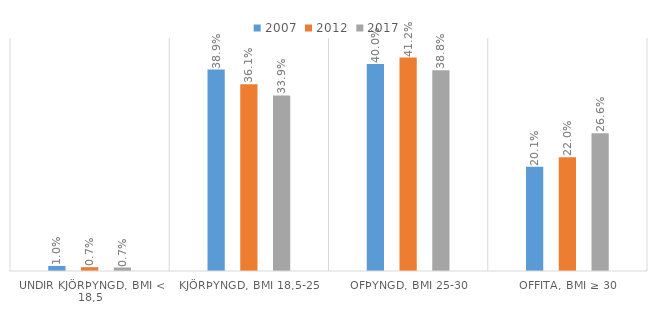
| Category | 2007 | 2012 | 2017 |
|---|---|---|---|
| Undir kjörþyngd, BMI < 18,5 | 0.01 | 0.007 | 0.007 |
| Kjörþyngd, BMI 18,5-25 | 0.389 | 0.361 | 0.339 |
| Ofþyngd, BMI 25-30 | 0.4 | 0.412 | 0.388 |
| Offita, BMI ≥ 30 | 0.201 | 0.22 | 0.266 |